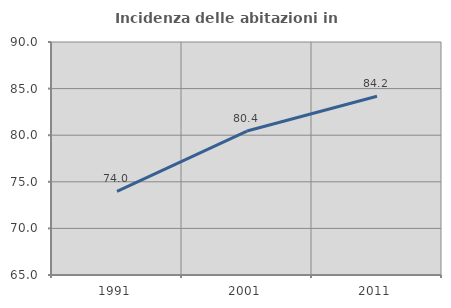
| Category | Incidenza delle abitazioni in proprietà  |
|---|---|
| 1991.0 | 73.982 |
| 2001.0 | 80.445 |
| 2011.0 | 84.179 |